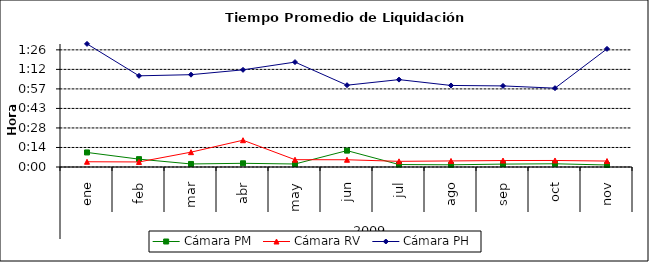
| Category | Cámara PM | Cámara RV | Cámara PH |
|---|---|---|---|
| 0 | 0.007 | 0.003 | 0.063 |
| 1 | 0.004 | 0.003 | 0.047 |
| 2 | 0.002 | 0.008 | 0.047 |
| 3 | 0.002 | 0.014 | 0.05 |
| 4 | 0.002 | 0.004 | 0.054 |
| 5 | 0.008 | 0.004 | 0.042 |
| 6 | 0.001 | 0.003 | 0.045 |
| 7 | 0.001 | 0.003 | 0.042 |
| 8 | 0.001 | 0.003 | 0.042 |
| 9 | 0.002 | 0.003 | 0.04 |
| 10 | 0.001 | 0.003 | 0.061 |